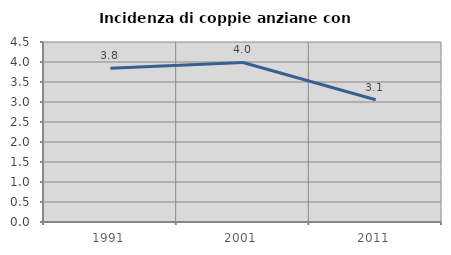
| Category | Incidenza di coppie anziane con figli |
|---|---|
| 1991.0 | 3.846 |
| 2001.0 | 3.989 |
| 2011.0 | 3.056 |